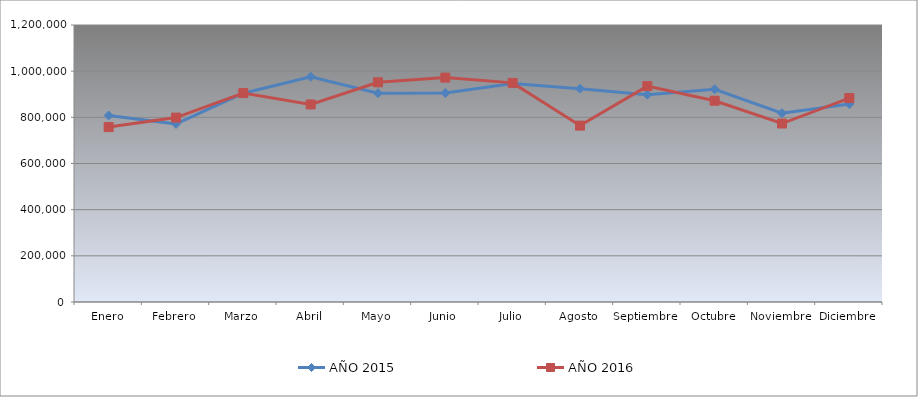
| Category | AÑO 2015 | AÑO 2016 |
|---|---|---|
| Enero | 808060 | 757740 |
| Febrero | 771340 | 798860 |
| Marzo | 904600 | 905050 |
| Abril | 976060 | 855765 |
| Mayo | 904360 | 951820 |
| Junio | 905580 | 972080 |
| Julio | 946360 | 949340 |
| Agosto | 923960 | 764160 |
| Septiembre | 898360 | 935340 |
| Octubre | 921420 | 872020 |
| Noviembre | 818180 | 773150 |
| Diciembre | 857560 | 883430 |